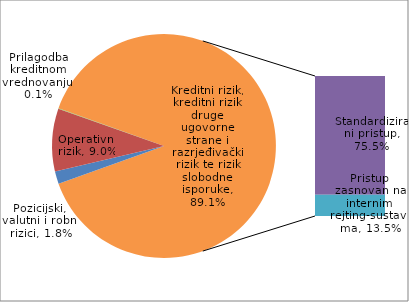
| Category | Kreditni rizik, kreditni rizik druge ugovorne strane i razrjeđivački rizik te rizik slobodne isporuke |
|---|---|
| Pozicijski, valutni i robni rizici | 0.018 |
| Operativni rizik | 0.09 |
| Prilagodba kreditnom vrednovanju | 0.001 |
| Standardizirani pristup | 0.755 |
| Pristup zasnovan na internim rejting-sustavima | 0.135 |